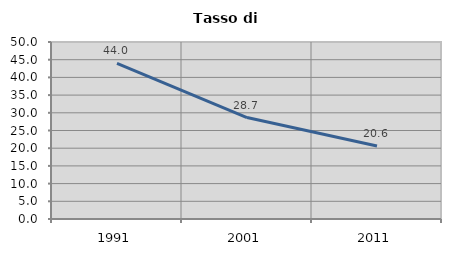
| Category | Tasso di disoccupazione   |
|---|---|
| 1991.0 | 43.983 |
| 2001.0 | 28.664 |
| 2011.0 | 20.628 |